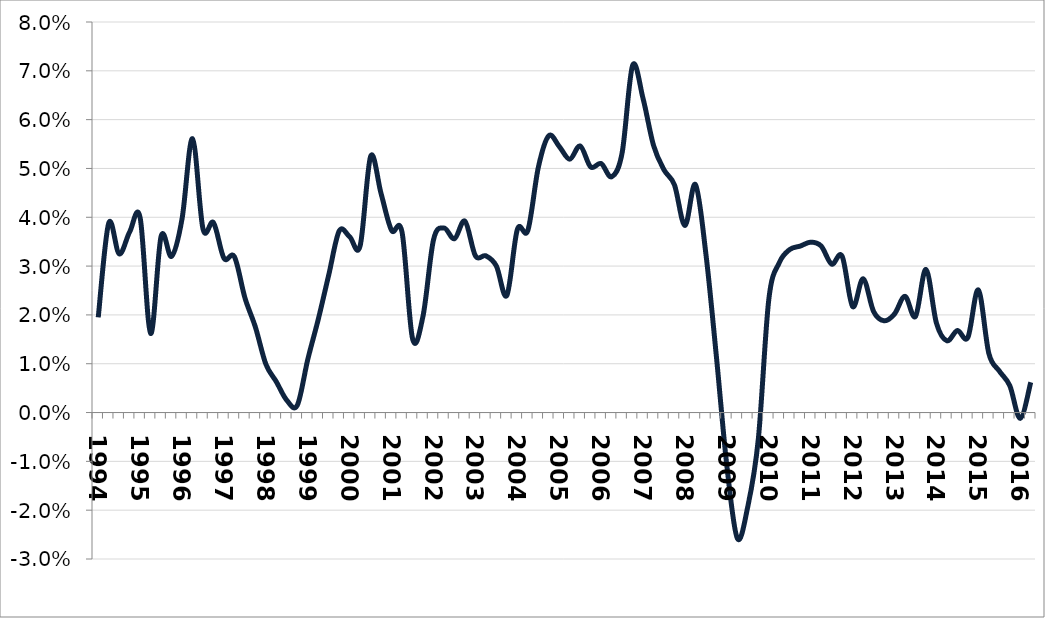
| Category | GDP |
|---|---|
| 1994.0 | 0.02 |
| nan | 0.039 |
| nan | 0.032 |
| nan | 0.037 |
| 1995.0 | 0.04 |
| nan | 0.016 |
| nan | 0.036 |
| nan | 0.032 |
| 1996.0 | 0.04 |
| nan | 0.056 |
| nan | 0.038 |
| nan | 0.039 |
| 1997.0 | 0.032 |
| nan | 0.032 |
| nan | 0.024 |
| nan | 0.018 |
| 1998.0 | 0.01 |
| nan | 0.006 |
| nan | 0.002 |
| nan | 0.002 |
| 1999.0 | 0.011 |
| nan | 0.019 |
| nan | 0.028 |
| nan | 0.037 |
| 2000.0 | 0.036 |
| nan | 0.034 |
| nan | 0.052 |
| nan | 0.045 |
| 2001.0 | 0.037 |
| nan | 0.037 |
| nan | 0.015 |
| nan | 0.02 |
| 2002.0 | 0.035 |
| nan | 0.038 |
| nan | 0.036 |
| nan | 0.039 |
| 2003.0 | 0.032 |
| nan | 0.032 |
| nan | 0.03 |
| nan | 0.024 |
| 2004.0 | 0.038 |
| nan | 0.037 |
| nan | 0.05 |
| nan | 0.057 |
| 2005.0 | 0.054 |
| nan | 0.052 |
| nan | 0.055 |
| nan | 0.05 |
| 2006.0 | 0.051 |
| nan | 0.048 |
| nan | 0.053 |
| nan | 0.071 |
| 2007.0 | 0.064 |
| nan | 0.055 |
| nan | 0.05 |
| nan | 0.047 |
| 2008.0 | 0.038 |
| nan | 0.047 |
| nan | 0.032 |
| nan | 0.011 |
| 2009.0 | -0.011 |
| nan | -0.026 |
| nan | -0.019 |
| nan | -0.005 |
| 2010.0 | 0.023 |
| nan | 0.031 |
| nan | 0.033 |
| nan | 0.034 |
| 2011.0 | 0.035 |
| nan | 0.034 |
| nan | 0.03 |
| nan | 0.032 |
| 2012.0 | 0.022 |
| nan | 0.027 |
| nan | 0.021 |
| nan | 0.019 |
| 2013.0 | 0.02 |
| nan | 0.024 |
| nan | 0.02 |
| nan | 0.029 |
| 2014.0 | 0.018 |
| nan | 0.015 |
| nan | 0.017 |
| nan | 0.015 |
| 2015.0 | 0.025 |
| nan | 0.012 |
| nan | 0.008 |
| nan | 0.006 |
| 2016.0 | -0.001 |
| nan | 0.006 |